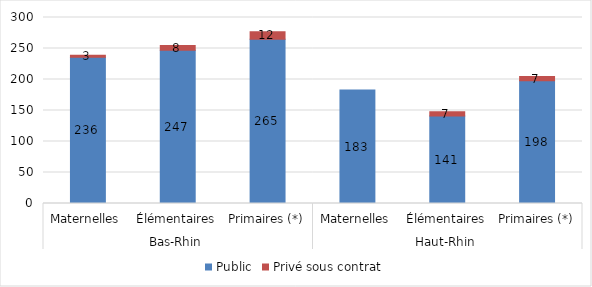
| Category | Public | Privé sous contrat |
|---|---|---|
| 0 | 236 | 3 |
| 1 | 247 | 8 |
| 2 | 265 | 12 |
| 3 | 183 | 0 |
| 4 | 141 | 7 |
| 5 | 198 | 7 |